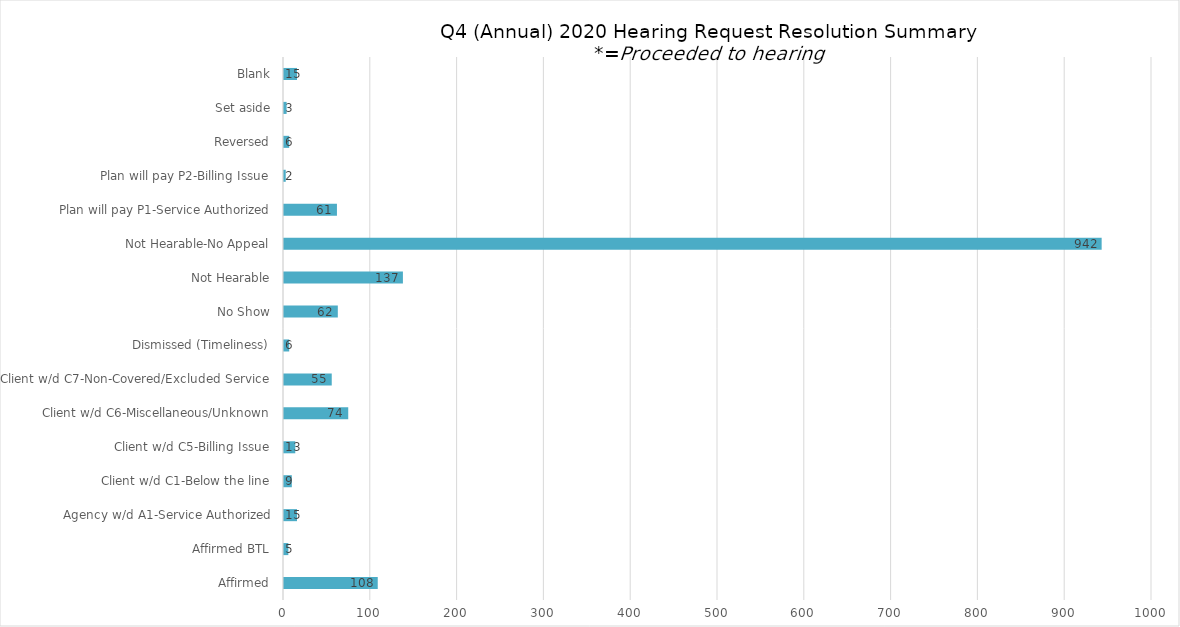
| Category | Series 0 |
|---|---|
| Affirmed | 108 |
| Affirmed BTL | 5 |
| Agency w/d A1-Service Authorized | 15 |
| Client w/d C1-Below the line | 9 |
| Client w/d C5-Billing Issue | 13 |
| Client w/d C6-Miscellaneous/Unknown | 74 |
| Client w/d C7-Non-Covered/Excluded Service | 55 |
| Dismissed (Timeliness) | 6 |
| No Show | 62 |
| Not Hearable | 137 |
| Not Hearable-No Appeal | 942 |
| Plan will pay P1-Service Authorized | 61 |
| Plan will pay P2-Billing Issue | 2 |
| Reversed | 6 |
| Set aside | 3 |
| Blank | 15 |